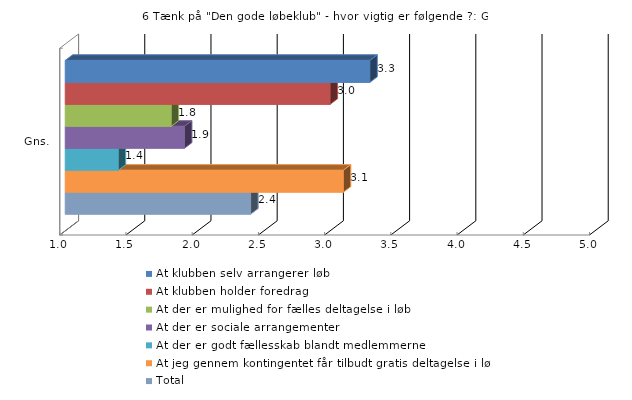
| Category | At klubben selv arrangerer løb | At klubben holder foredrag | At der er mulighed for fælles deltagelse i løb | At der er sociale arrangementer | At der er godt fællesskab blandt medlemmerne | At jeg gennem kontingentet får tilbudt gratis deltagelse i løb | Total |
|---|---|---|---|---|---|---|---|
| Gns. | 3.3 | 3 | 1.8 | 1.9 | 1.4 | 3.1 | 2.4 |